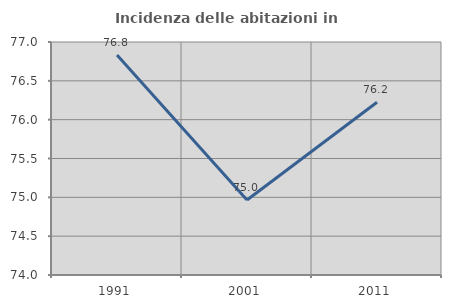
| Category | Incidenza delle abitazioni in proprietà  |
|---|---|
| 1991.0 | 76.833 |
| 2001.0 | 74.965 |
| 2011.0 | 76.224 |